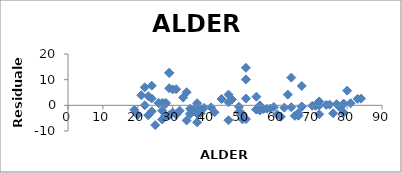
| Category | Series 0 |
|---|---|
| 35.0 | -3.343 |
| 51.0 | 14.641 |
| 57.0 | -1.358 |
| 58.0 | -1.268 |
| 28.0 | 1.025 |
| 36.0 | -2.253 |
| 37.0 | -3.163 |
| 67.0 | 7.544 |
| 79.0 | -2.833 |
| 84.0 | 2.619 |
| 27.0 | -5.525 |
| 72.0 | -3.464 |
| 37.0 | -1.163 |
| 72.0 | -0.004 |
| 29.0 | 12.656 |
| 29.0 | 6.656 |
| 64.0 | 10.814 |
| 54.0 | 3.371 |
| 32.0 | -2.073 |
| 79.0 | 0.627 |
| 34.0 | 5.107 |
| 71.0 | -0.095 |
| 56.0 | -1.448 |
| 46.0 | 4.19 |
| 20.0 | -3.697 |
| 37.0 | -3.163 |
| 22.0 | 7.024 |
| 21.0 | 3.934 |
| 30.0 | 6.206 |
| 23.0 | -3.886 |
| 31.0 | -3.704 |
| 65.0 | -4.096 |
| 63.0 | 4.183 |
| 28.0 | -3.975 |
| 25.0 | -7.705 |
| 72.0 | 1.536 |
| 66.0 | -4.006 |
| 44.0 | 2.469 |
| 41.0 | -0.802 |
| 76.0 | -3.103 |
| 49.0 | -2.54 |
| 37.0 | -3.163 |
| 28.0 | 0.566 |
| 46.0 | -5.81 |
| 29.0 | -3.884 |
| 42.0 | -2.711 |
| 35.0 | -3.343 |
| 37.0 | -0.163 |
| 19.0 | -1.787 |
| 77.0 | 0.447 |
| 39.0 | -0.982 |
| 71.0 | -0.095 |
| 33.0 | 3.017 |
| 29.0 | 12.656 |
| 51.0 | -5.359 |
| 49.0 | -0.54 |
| 70.0 | -0.185 |
| 26.0 | 0.845 |
| 75.0 | 0.266 |
| 66.0 | -4.006 |
| 55.0 | -1.998 |
| 59.0 | -0.637 |
| 38.0 | -3.072 |
| 78.0 | -0.923 |
| 50.0 | -5.449 |
| 51.0 | 10.101 |
| 66.0 | -3.006 |
| 37.0 | -1.622 |
| 31.0 | 6.296 |
| 62.0 | -0.907 |
| 74.0 | 0.176 |
| 24.0 | -2.336 |
| 51.0 | 2.641 |
| 79.0 | 0.627 |
| 81.0 | 0.808 |
| 61.0 | -4.457 |
| 24.0 | 7.664 |
| 71.0 | -0.095 |
| 80.0 | 5.717 |
| 67.0 | -0.456 |
| 30.0 | -2.794 |
| 37.0 | 0.837 |
| 26.0 | 0.845 |
| 35.0 | -1.343 |
| 24.0 | 2.664 |
| 22.0 | 0.024 |
| 83.0 | 2.528 |
| 46.0 | 1.19 |
| 38.0 | -1.532 |
| 64.0 | -0.726 |
| 55.0 | 0.002 |
| 50.0 | -3.449 |
| 28.0 | -3.975 |
| 34.0 | -5.893 |
| 54.0 | -1.629 |
| 60.0 | -3.547 |
| 27.0 | 0.935 |
| 37.0 | -6.622 |
| 67.0 | -0.456 |
| 23.0 | 3.574 |
| 27.0 | -2.065 |
| 47.0 | 2.28 |
| 54.0 | -1.629 |